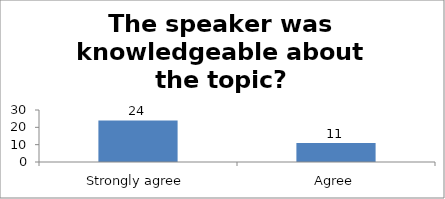
| Category | The speaker was knowledgeable about the topic? |
|---|---|
| Strongly agree | 24 |
| Agree | 11 |